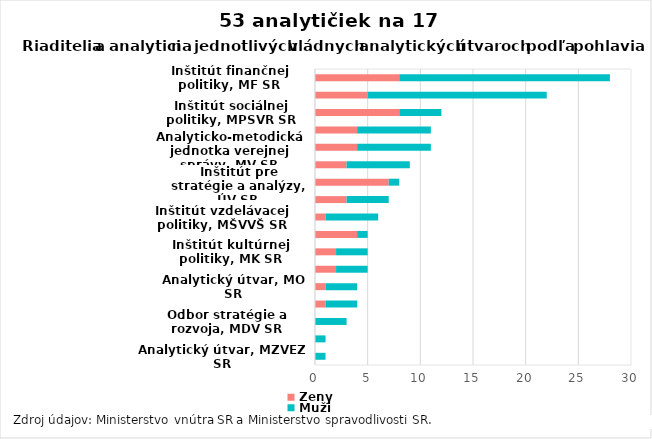
| Category | Ženy | Muži |
|---|---|---|
| Analytický útvar, MZVEZ SR | 0 | 1 |
| Analytický útvar, ÚPVII SR | 0 | 1 |
| Odbor stratégie a rozvoja, MDV SR | 0 | 3 |
| Inštitút pôdohospodárskej politiky, MPRV SR | 1 | 3 |
| Analytický útvar, MO SR | 1 | 3 |
| Centrum pre hospodárske otázky, MH SR | 2 | 3 |
| Inštitút kultúrnej politiky, MK SR | 2 | 3 |
| Implementačná jednotka, ÚV SR | 4 | 1 |
| Inštitút vzdelávacej politiky, MŠVVŠ SR | 1 | 5 |
| Inštitút enviromentálnej politiky, MŽ SR | 3 | 4 |
| Inštitút pre stratégie a analýzy, ÚV SR | 7 | 1 |
| Analytické centrum, MS SR | 3 | 6 |
| Analyticko-metodická jednotka verejnej správy, MV SR | 4 | 7 |
| Inštitút zdravotnej politiky, MZ SR | 4 | 7 |
| Inštitút sociálnej politiky, MPSVR SR | 8 | 4 |
| Útvar hodnoty za peniaze, MF SR | 5 | 17 |
| Inštitút finančnej politiky, MF SR | 8 | 20 |